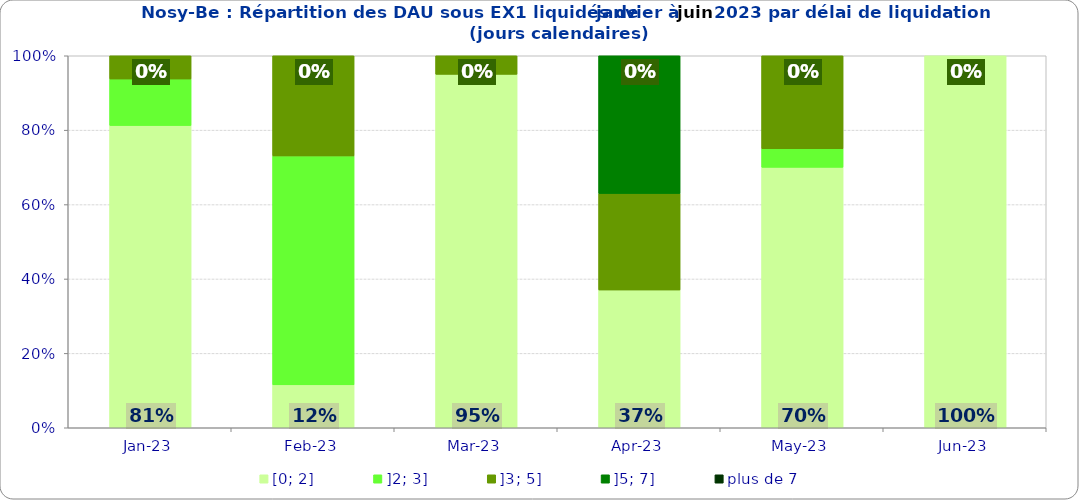
| Category | [0; 2] | ]2; 3] | ]3; 5] | ]5; 7] | plus de 7 |
|---|---|---|---|---|---|
| 2023-01-01 | 0.812 | 0.125 | 0.062 | 0 | 0 |
| 2023-02-01 | 0.115 | 0.615 | 0.269 | 0 | 0 |
| 2023-03-01 | 0.95 | 0 | 0.05 | 0 | 0 |
| 2023-04-01 | 0.37 | 0 | 0.259 | 0.37 | 0 |
| 2023-05-01 | 0.7 | 0.05 | 0.25 | 0 | 0 |
| 2023-06-01 | 1 | 0 | 0 | 0 | 0 |